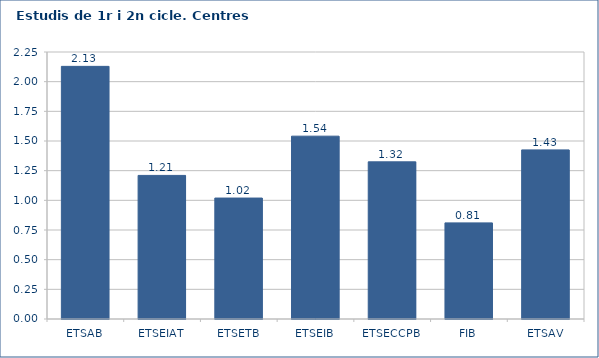
| Category | 2007-08 |
|---|---|
| ETSAB | 2.129 |
| ETSEIAT | 1.21 |
| ETSETB | 1.019 |
| ETSEIB | 1.541 |
| ETSECCPB | 1.324 |
| FIB | 0.81 |
| ETSAV | 1.425 |